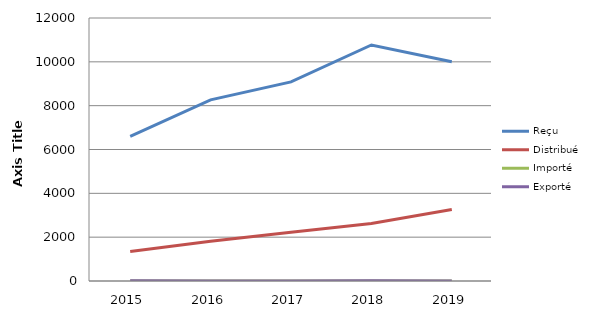
| Category | Reçu | Distribué | Importé | Exporté |
|---|---|---|---|---|
| 2015.0 | 6595 | 1349 | 0 | 6 |
| 2016.0 | 8267 | 1809 | 0 | 3 |
| 2017.0 | 9084 | 2221 | 0 | 5 |
| 2018.0 | 10769 | 2625 | 0 | 10 |
| 2019.0 | 10000 | 3264 | 0 | 0 |